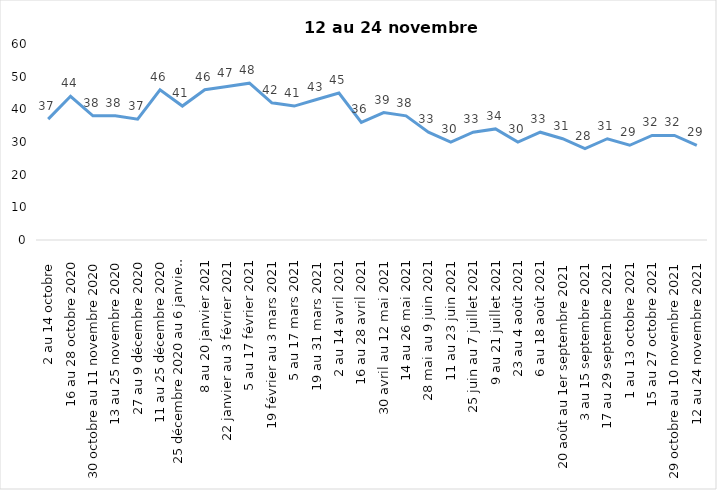
| Category | Toujours aux trois mesures |
|---|---|
| 2 au 14 octobre  | 37 |
| 16 au 28 octobre 2020 | 44 |
| 30 octobre au 11 novembre 2020 | 38 |
| 13 au 25 novembre 2020 | 38 |
| 27 au 9 décembre 2020 | 37 |
| 11 au 25 décembre 2020 | 46 |
| 25 décembre 2020 au 6 janvier 2021 | 41 |
| 8 au 20 janvier 2021 | 46 |
| 22 janvier au 3 février 2021 | 47 |
| 5 au 17 février 2021 | 48 |
| 19 février au 3 mars 2021 | 42 |
| 5 au 17 mars 2021 | 41 |
| 19 au 31 mars 2021 | 43 |
| 2 au 14 avril 2021 | 45 |
| 16 au 28 avril 2021 | 36 |
| 30 avril au 12 mai 2021 | 39 |
| 14 au 26 mai 2021 | 38 |
| 28 mai au 9 juin 2021 | 33 |
| 11 au 23 juin 2021 | 30 |
| 25 juin au 7 juillet 2021 | 33 |
| 9 au 21 juillet 2021 | 34 |
| 23 au 4 août 2021 | 30 |
| 6 au 18 août 2021 | 33 |
| 20 août au 1er septembre 2021 | 31 |
| 3 au 15 septembre 2021 | 28 |
| 17 au 29 septembre 2021 | 31 |
| 1 au 13 octobre 2021 | 29 |
| 15 au 27 octobre 2021 | 32 |
| 29 octobre au 10 novembre 2021 | 32 |
| 12 au 24 novembre 2021 | 29 |